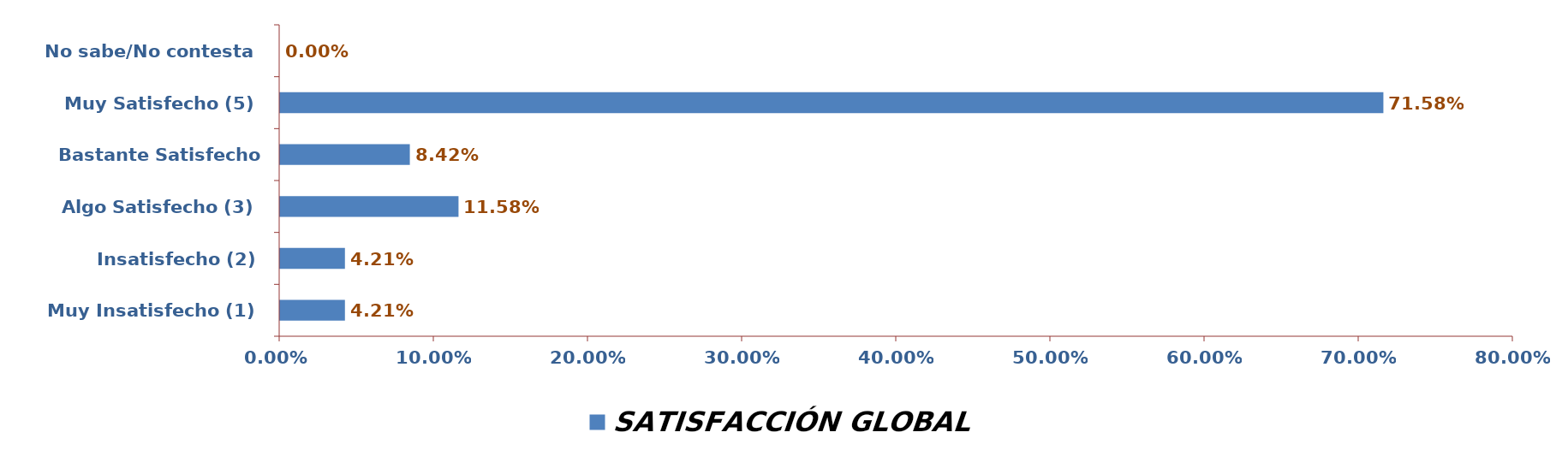
| Category | SATISFACCIÓN GLOBAL |
|---|---|
| Muy Insatisfecho (1) | 0.042 |
| Insatisfecho (2) | 0.042 |
| Algo Satisfecho (3) | 0.116 |
| Bastante Satisfecho (4) | 0.084 |
| Muy Satisfecho (5) | 0.716 |
| No sabe/No contesta | 0 |